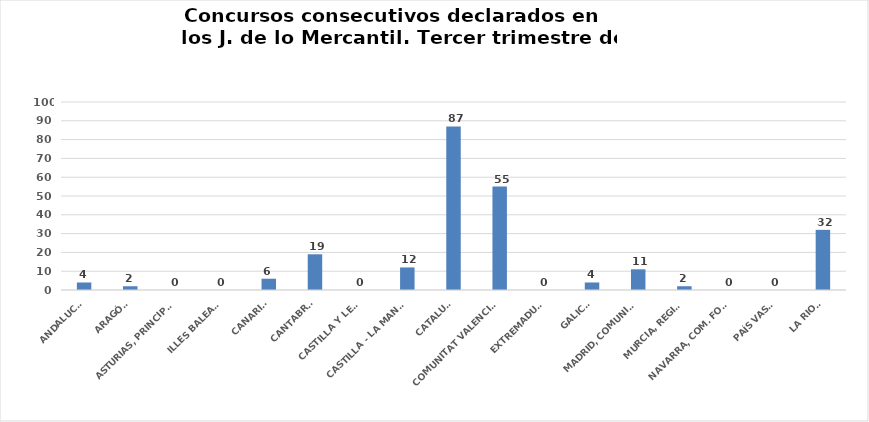
| Category | Series 0 |
|---|---|
| ANDALUCÍA | 4 |
| ARAGÓN | 2 |
| ASTURIAS, PRINCIPADO | 0 |
| ILLES BALEARS | 0 |
| CANARIAS | 6 |
| CANTABRIA | 19 |
| CASTILLA Y LEÓN | 0 |
| CASTILLA - LA MANCHA | 12 |
| CATALUÑA | 87 |
| COMUNITAT VALENCIANA | 55 |
| EXTREMADURA | 0 |
| GALICIA | 4 |
| MADRID, COMUNIDAD | 11 |
| MURCIA, REGIÓN | 2 |
| NAVARRA, COM. FORAL | 0 |
| PAÍS VASCO | 0 |
| LA RIOJA | 32 |